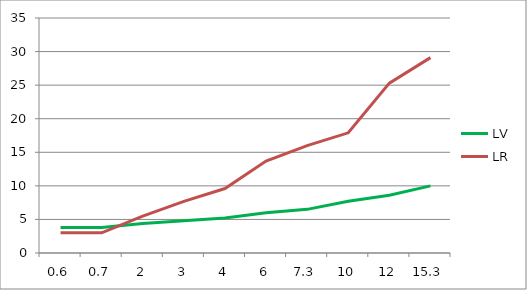
| Category | LV | LR |
|---|---|---|
| 0.6 | 3.8 | 3 |
| 0.7 | 3.8 | 3 |
| 2.0 | 4.4 | 5.5 |
| 3.0 | 4.8 | 7.7 |
| 4.0 | 5.2 | 9.6 |
| 6.0 | 6 | 13.7 |
| 7.3 | 6.5 | 16 |
| 10.0 | 7.7 | 17.9 |
| 12.0 | 8.6 | 25.3 |
| 15.3 | 10 | 29.1 |